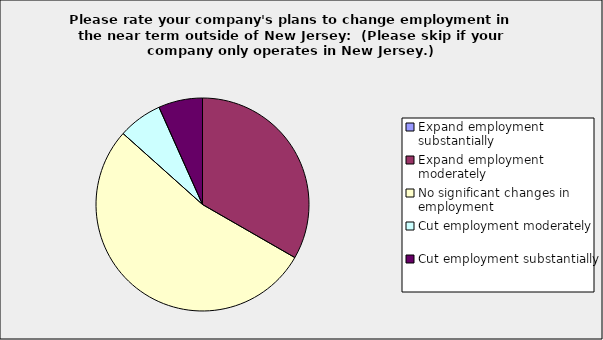
| Category | Series 0 |
|---|---|
| Expand employment substantially | 0 |
| Expand employment moderately | 0.333 |
| No significant changes in employment | 0.533 |
| Cut employment moderately | 0.067 |
| Cut employment substantially | 0.067 |